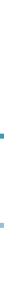
| Category | Quantity | Cost |
|---|---|---|
| 0 | 1 | 1 |